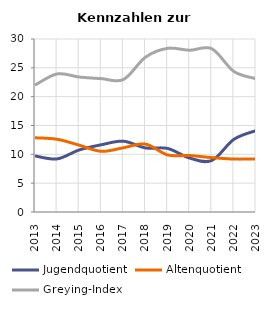
| Category | Jugendquotient | Altenquotient | Greying-Index |
|---|---|---|---|
| 2013.0 | 9.722 | 12.87 | 22 |
| 2014.0 | 9.208 | 12.615 | 23.944 |
| 2015.0 | 10.759 | 11.593 | 23.404 |
| 2016.0 | 11.658 | 10.522 | 23.129 |
| 2017.0 | 12.276 | 11.138 | 22.973 |
| 2018.0 | 11.111 | 11.779 | 26.846 |
| 2019.0 | 11.023 | 9.901 | 28.387 |
| 2020.0 | 9.35 | 9.79 | 28.05 |
| 2021.0 | 8.94 | 9.433 | 28.313 |
| 2022.0 | 12.6 | 9.18 | 24.37 |
| 2023.0 | 14.114 | 9.2 | 23.116 |